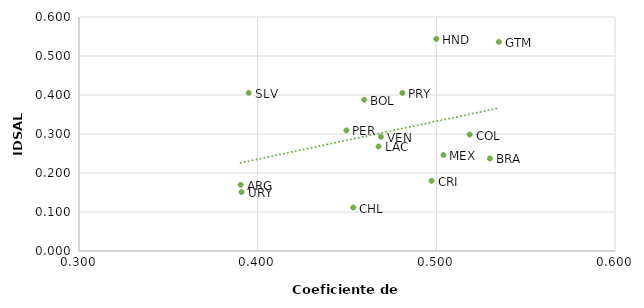
| Category | Series 0 |
|---|---|
| 0.5 | 0.544 |
| 0.535 | 0.536 |
| 0.45966666666666667 | 0.388 |
| 0.481 | 0.405 |
| 0.44966666666666666 | 0.309 |
| 0.395 | 0.406 |
| 0.4676666666666667 | 0.268 |
| 0.5186666666666667 | 0.299 |
| 0.504 | 0.246 |
| 0.469 | 0.293 |
| 0.5300000000000001 | 0.237 |
| 0.49733333333333335 | 0.18 |
| 0.3905 | 0.17 |
| 0.391 | 0.151 |
| 0.4535 | 0.112 |